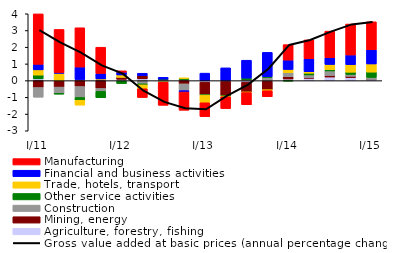
| Category | Agriculture, forestry, fishing | Mining, energy  | Construction | Other service activities  | Trade, hotels, transport | Financial and business activities  | Manufacturing |
|---|---|---|---|---|---|---|---|
| I/11 | 0.108 | -0.409 | -0.582 | 0.226 | 0.311 | 0.331 | 3.018 |
| II | -0.023 | -0.362 | -0.407 | 0 | 0.439 | 0.046 | 2.579 |
| III | 0.065 | -0.352 | -0.656 | -0.165 | -0.292 | 0.749 | 2.349 |
| IV | 0.076 | -0.467 | -0.172 | -0.385 | 0.027 | 0.326 | 1.571 |
| I/12 | 0.078 | 0.118 | -0.039 | -0.138 | 0.144 | 0.163 | 0.085 |
| II | 0.108 | 0.19 | -0.193 | -0.062 | -0.231 | 0.143 | -0.523 |
| III | 0.025 | 0.041 | -0.096 | 0.024 | -0.007 | 0.11 | -1.373 |
| IV | 0.07 | -0.191 | -0.405 | 0.065 | 0.014 | -0.085 | -1.09 |
| I/13 | -0.089 | -0.765 | -0.01 | -0.004 | -0.459 | 0.449 | -0.829 |
| II | -0.042 | -0.853 | 0.013 | -0.027 | -0.043 | 0.752 | -0.706 |
| III | -0.089 | -0.595 | 0.058 | 0.093 | -0.031 | 1.071 | -0.73 |
|  IV | -0.032 | -0.509 | 0.198 | 0.042 | -0.064 | 1.452 | -0.359 |
| I/14 | 0.098 | 0.132 | 0.25 | -0.027 | 0.188 | 0.563 | 0.924 |
| II | 0.14 | 0.045 | 0.156 | 0.105 | 0.083 | 0.778 | 1.127 |
| III | 0.217 | 0.09 | 0.273 | 0.068 | 0.32 | 0.4 | 1.595 |
|  IV | 0.185 | 0.074 | 0.113 | 0.133 | 0.454 | 0.576 | 1.853 |
| I/15 | 0.069 | 0.002 | 0.121 | 0.321 | 0.486 | 0.849 | 1.673 |